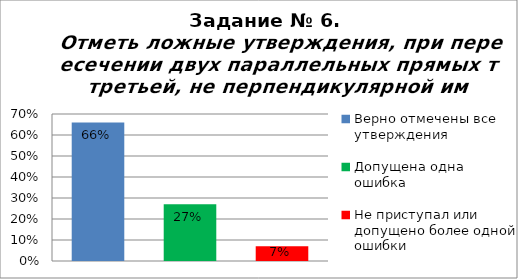
| Category | Отметь ложные утверждения, при пересечении двух параллельных прямых третьей, не перпендикулярной им. |
|---|---|
| Верно отмечены все утверждения | 0.66 |
| Допущена одна ошибка | 0.27 |
| Не приступал или допущено более одной ошибки | 0.07 |